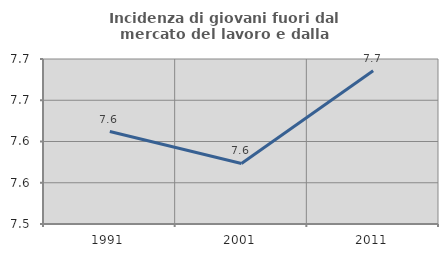
| Category | Incidenza di giovani fuori dal mercato del lavoro e dalla formazione  |
|---|---|
| 1991.0 | 7.612 |
| 2001.0 | 7.573 |
| 2011.0 | 7.686 |